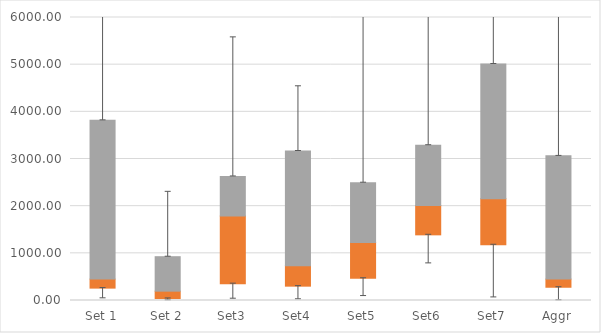
| Category | Q1 | Median-Q1 | Q3-Median |
|---|---|---|---|
| Set 1 | 262.42 | 191.104 | 3366.661 |
| Set 2 | 42.812 | 155.188 | 730.897 |
| Set3 | 356.171 | 1433.594 | 841.4 |
| Set4 | 303.927 | 433.073 | 2433.326 |
| Set5 | 470.917 | 757.252 | 1270.281 |
| Set6 | 1392.015 | 621.603 | 1279.333 |
| Set7 | 1180.697 | 974.086 | 2860.417 |
| Aggr | 280.866 | 172.657 | 2613.06 |